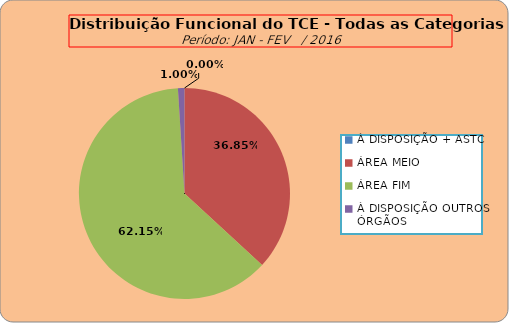
| Category | Series 0 |
|---|---|
| À DISPOSIÇÃO + ASTC | 0 |
| ÁREA MEIO | 185 |
| ÁREA FIM | 312 |
| À DISPOSIÇÃO OUTROS ÓRGÃOS | 5 |